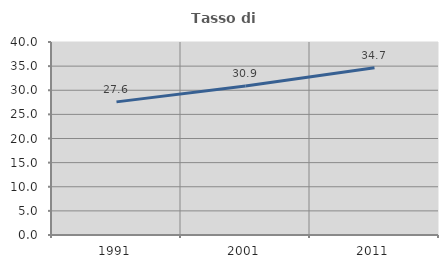
| Category | Tasso di occupazione   |
|---|---|
| 1991.0 | 27.591 |
| 2001.0 | 30.876 |
| 2011.0 | 34.672 |